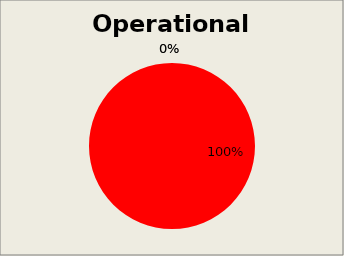
| Category | Series 5 |
|---|---|
| 0 | 0 |
| 1 | 31 |
| 2 | 0 |